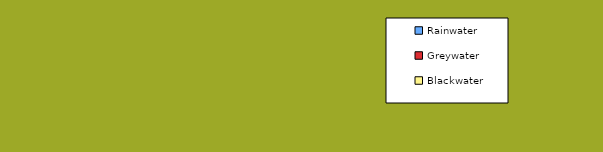
| Category | Series 0 | Series 1 |
|---|---|---|
| Rainwater | 0 |  |
| Greywater | 0 |  |
| Blackwater | 0 |  |